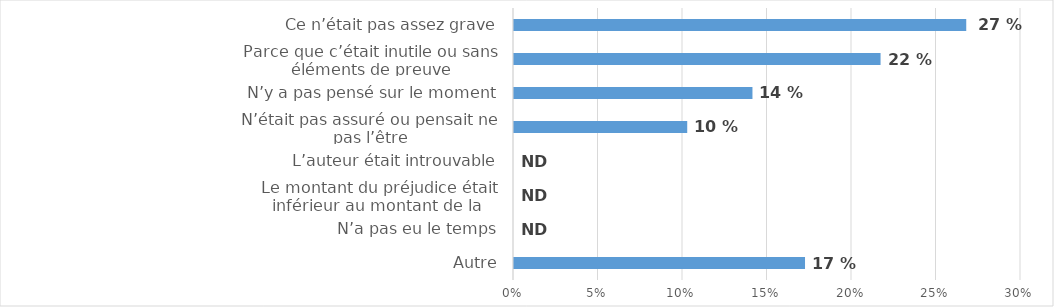
| Category | Series 0 |
|---|---|
|  Autre | 0.172 |
|  N’a pas eu le temps | 0 |
|  Le montant du préjudice était inférieur au montant de la franchise | 0 |
| L’auteur était introuvable | 0 |
| N’était pas assuré ou pensait ne pas l’être | 0.102 |
| N’y a pas pensé sur le moment | 0.141 |
| Parce que c’était inutile ou sans éléments de preuve | 0.217 |
| Ce n’était pas assez grave | 0.268 |